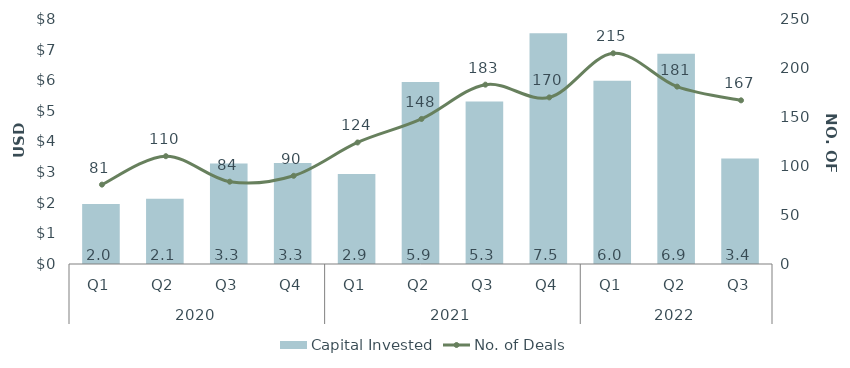
| Category | Capital Invested |
|---|---|
| 0 | 1.962 |
| 1 | 2.134 |
| 2 | 3.284 |
| 3 | 3.296 |
| 4 | 2.935 |
| 5 | 5.945 |
| 6 | 5.306 |
| 7 | 7.538 |
| 8 | 5.987 |
| 9 | 6.868 |
| 10 | 3.445 |